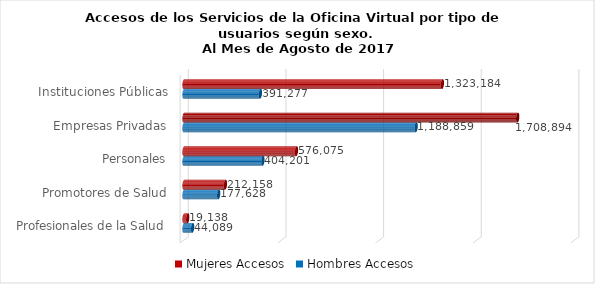
| Category | Mujeres | Hombres |
|---|---|---|
| Instituciones Públicas | 1323184 | 391277 |
| Empresas Privadas | 1708894 | 1188859 |
| Personales | 576075 | 404201 |
| Promotores de Salud | 212158 | 177628 |
| Profesionales de la Salud | 19138 | 44089 |